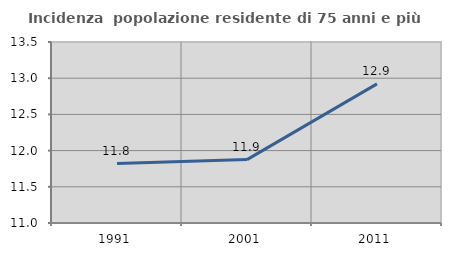
| Category | Incidenza  popolazione residente di 75 anni e più |
|---|---|
| 1991.0 | 11.821 |
| 2001.0 | 11.876 |
| 2011.0 | 12.921 |